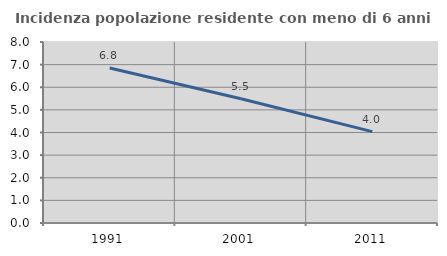
| Category | Incidenza popolazione residente con meno di 6 anni |
|---|---|
| 1991.0 | 6.85 |
| 2001.0 | 5.493 |
| 2011.0 | 4.039 |